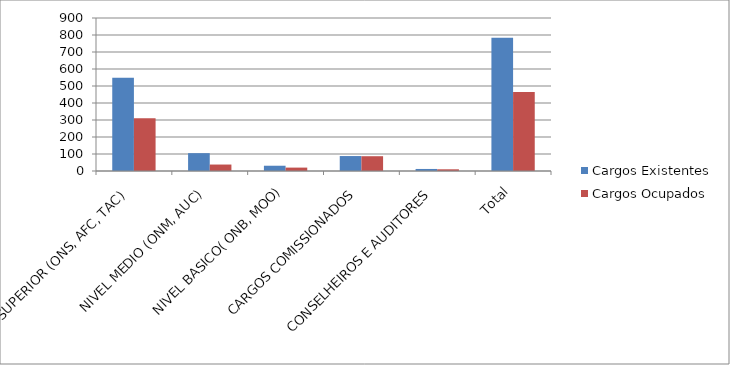
| Category | Cargos Existentes | Cargos Ocupados |
|---|---|---|
| NIVEL SUPERIOR (ONS, AFC, TAC) | 548 | 310 |
| NIVEL MEDIO (ONM, AUC) | 105 | 38 |
| NIVEL BASICO( ONB, MOO) | 31 | 20 |
| CARGOS COMISSIONADOS | 88 | 87 |
| CONSELHEIROS E AUDITORES | 12 | 10 |
| Total | 784 | 465 |